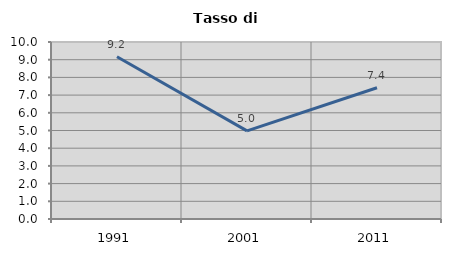
| Category | Tasso di disoccupazione   |
|---|---|
| 1991.0 | 9.17 |
| 2001.0 | 4.981 |
| 2011.0 | 7.416 |